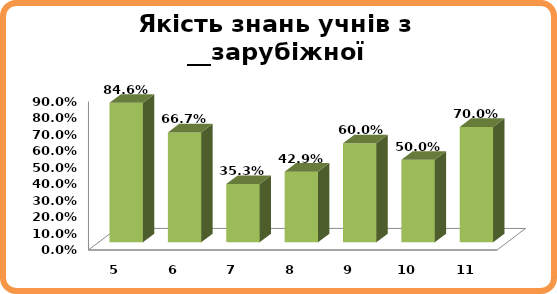
| Category | Series 0 |
|---|---|
| 5.0 | 0.846 |
| 6.0 | 0.667 |
| 7.0 | 0.353 |
| 8.0 | 0.429 |
| 9.0 | 0.6 |
| 10.0 | 0.5 |
| 11.0 | 0.7 |